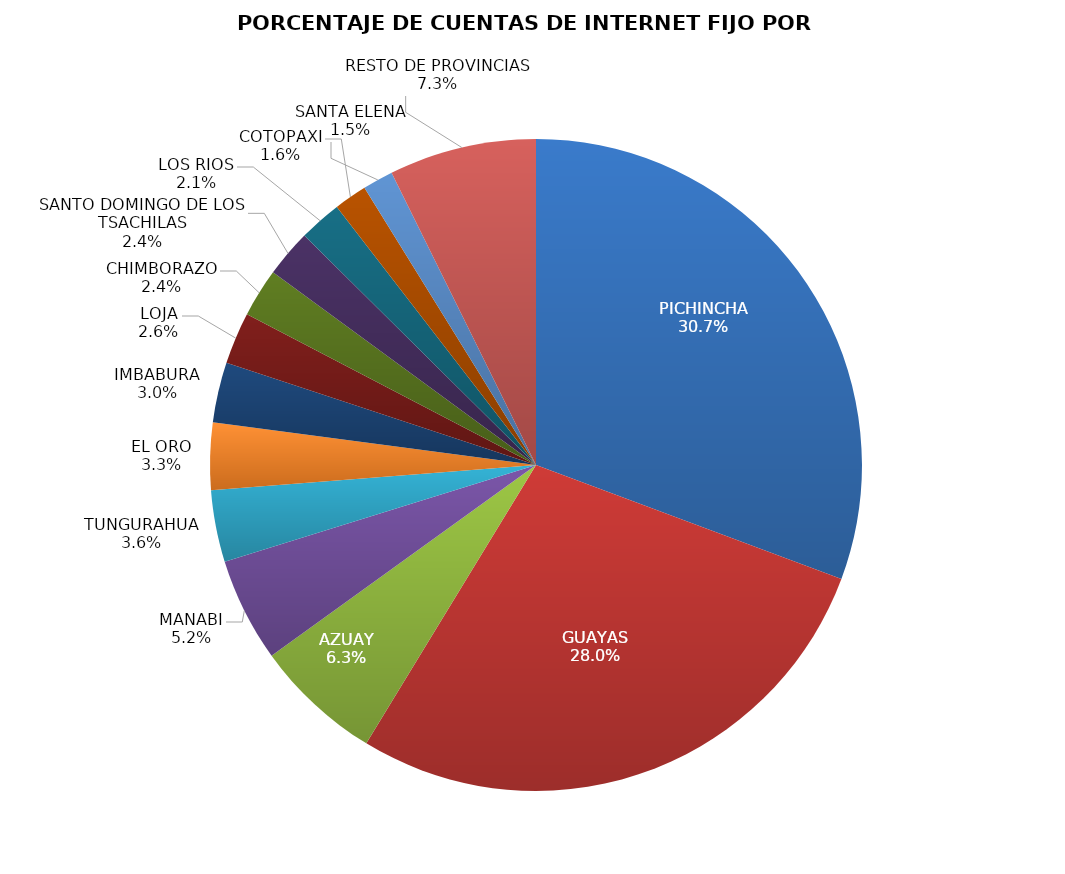
| Category | PORCENTAJE DE CUENTAS DE INTERNET FIJO |
|---|---|
| PICHINCHA | 0.307 |
| GUAYAS | 0.28 |
| AZUAY | 0.063 |
| MANABI | 0.051 |
| TUNGURAHUA | 0.036 |
| EL ORO | 0.033 |
| IMBABURA | 0.03 |
| LOJA | 0.026 |
| CHIMBORAZO | 0.024 |
| SANTO DOMINGO DE LOS TSACHILAS | 0.024 |
| LOS RIOS | 0.021 |
| COTOPAXI | 0.016 |
| SANTA ELENA | 0.015 |
| RESTO DE PROVINCIAS | 0.073 |